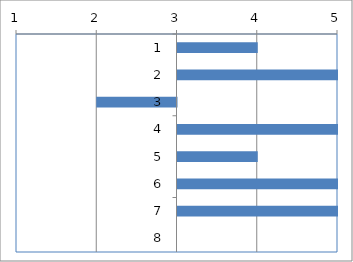
| Category | Series 0 |
|---|---|
| 0 | 4 |
| 1 | 5 |
| 2 | 2 |
| 3 | 5 |
| 4 | 4 |
| 5 | 5 |
| 6 | 5 |
| 7 | 3 |